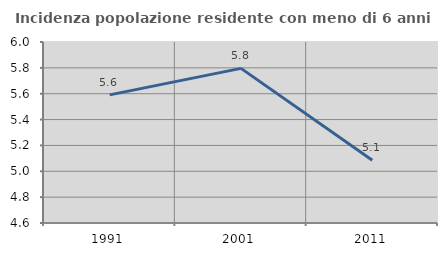
| Category | Incidenza popolazione residente con meno di 6 anni |
|---|---|
| 1991.0 | 5.591 |
| 2001.0 | 5.796 |
| 2011.0 | 5.085 |